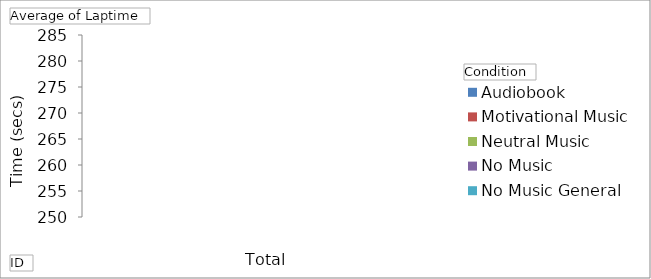
| Category | Audiobook | Motivational Music | Neutral Music | No Music | No Music General |
|---|---|---|---|---|---|
| Athlete 1 | 231.63 | 231.403 | 228.345 | 222.852 | 193.502 |